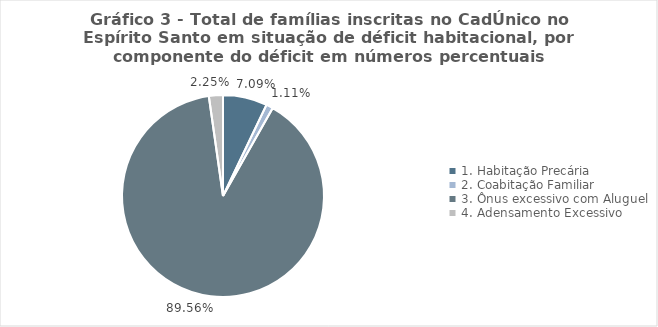
| Category | Series 0 | Series 1 |
|---|---|---|
| 1. Habitação Precária | 0.071 | 0.013 |
| 2. Coabitação Familiar | 0.011 | 0.899 |
| 3. Ônus excessivo com Aluguel | 0.896 | 0.018 |
| 4. Adensamento Excessivo | 0.022 | 0.022 |